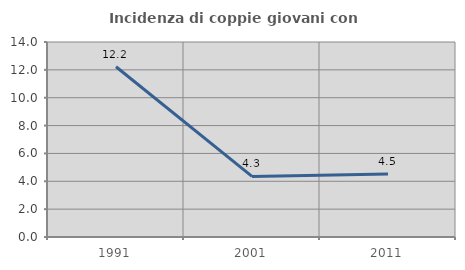
| Category | Incidenza di coppie giovani con figli |
|---|---|
| 1991.0 | 12.222 |
| 2001.0 | 4.348 |
| 2011.0 | 4.52 |